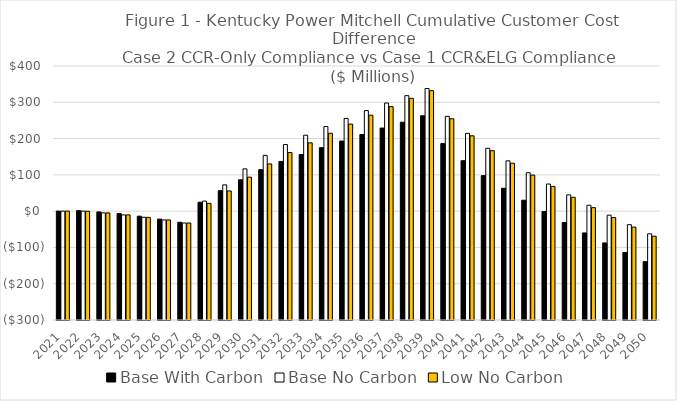
| Category | Base With Carbon | Base No Carbon | Low No Carbon |
|---|---|---|---|
| 2021.0 | 0.11 | 0.11 | 0.11 |
| 2022.0 | 1.351 | 0.055 | -0.334 |
| 2023.0 | -2.185 | -4.789 | -4.844 |
| 2024.0 | -6.566 | -10.331 | -10.384 |
| 2025.0 | -13.869 | -16.85 | -17.149 |
| 2026.0 | -21.964 | -24.236 | -24.275 |
| 2027.0 | -30.671 | -32.751 | -32.782 |
| 2028.0 | 24.546 | 27.617 | 21.485 |
| 2029.0 | 56.485 | 72.433 | 55.713 |
| 2030.0 | 86.365 | 116.503 | 93.74 |
| 2031.0 | 114.317 | 153.76 | 130.199 |
| 2032.0 | 136.855 | 183.52 | 161.383 |
| 2033.0 | 156.182 | 209.249 | 188.207 |
| 2034.0 | 174.923 | 233.173 | 214.607 |
| 2035.0 | 193.19 | 255.514 | 239.826 |
| 2036.0 | 211.234 | 277.224 | 264.43 |
| 2037.0 | 228.969 | 297.979 | 288.019 |
| 2038.0 | 245.106 | 318.269 | 310.957 |
| 2039.0 | 262.85 | 338.068 | 332.02 |
| 2040.0 | 186.121 | 261.297 | 254.682 |
| 2041.0 | 138.974 | 214.285 | 207.666 |
| 2042.0 | 97.853 | 173.315 | 166.694 |
| 2043.0 | 63.03 | 138.654 | 132.033 |
| 2044.0 | 30.093 | 105.885 | 99.263 |
| 2045.0 | -1.187 | 74.776 | 68.154 |
| 2046.0 | -31.271 | 44.862 | 38.24 |
| 2047.0 | -60.048 | 16.256 | 9.634 |
| 2048.0 | -87.545 | -11.07 | -17.692 |
| 2049.0 | -114.008 | -37.363 | -43.985 |
| 2050.0 | -139.237 | -62.422 | -69.044 |